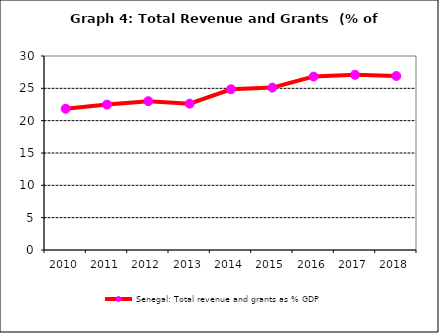
| Category | Senegal: Total revenue and grants as % GDP |
|---|---|
| 2010.0 | 21.843 |
| 2011.0 | 22.489 |
| 2012.0 | 23.013 |
| 2013.0 | 22.626 |
| 2014.0 | 24.852 |
| 2015.0 | 25.113 |
| 2016.0 | 26.816 |
| 2017.0 | 27.097 |
| 2018.0 | 26.908 |